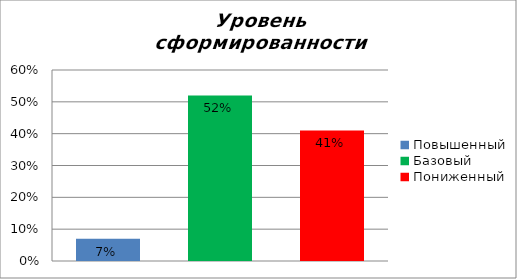
| Category | Уровень сформированности предметных результатов |
|---|---|
| Повышенный | 0.07 |
| Базовый | 0.52 |
| Пониженный | 0.41 |